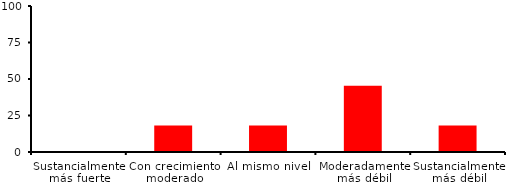
| Category | Series 0 |
|---|---|
| Sustancialmente más fuerte | 0 |
| Con crecimiento moderado | 18.182 |
| Al mismo nivel | 18.182 |
| Moderadamente más débil | 45.455 |
| Sustancialmente más débil | 18.182 |